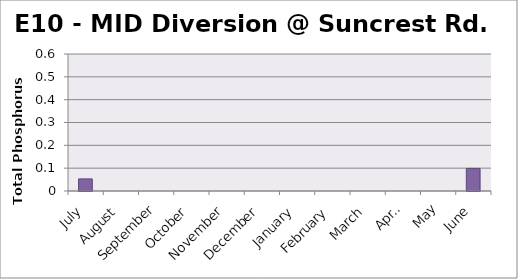
| Category | Phosphorus (mg/L) |
|---|---|
| July | 0.053 |
| August | 0 |
| September | 0 |
| October | 0 |
| November | 0 |
| December | 0 |
| January | 0 |
| February | 0 |
| March | 0 |
| April | 0 |
| May | 0 |
| June | 0.099 |